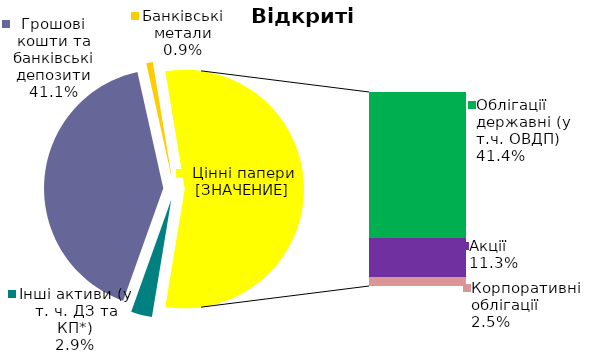
| Category | Series 0 |
|---|---|
| Інші активи (у т. ч. ДЗ та КП*) | 0.029 |
| Грошові кошти та банківські депозити | 0.411 |
| Банківські метали | 0.009 |
| Облігації державні (у т.ч. ОВДП) | 0.414 |
| Облігації місцевих позик | 0 |
| Акцiї | 0.113 |
| Корпоративні облігації | 0.025 |